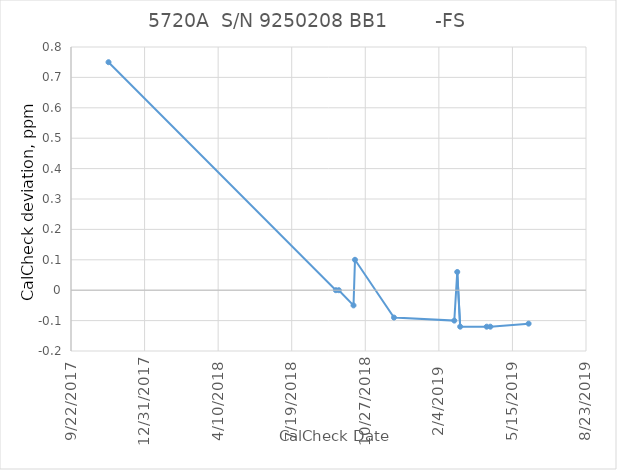
| Category |        -FS |
|---|---|
| 43051.0 | 0.75 |
| 43360.0 | 0 |
| 43364.0 | 0 |
| 43384.0 | -0.05 |
| 43386.0 | 0.1 |
| 43439.0 | -0.09 |
| 43521.0 | -0.1 |
| 43525.0 | 0.06 |
| 43529.0 | -0.12 |
| 43565.0 | -0.12 |
| 43570.0 | -0.12 |
| 43622.0 | -0.11 |